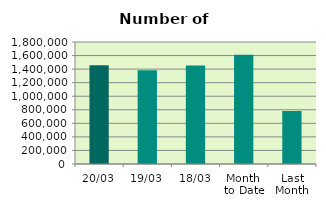
| Category | Series 0 |
|---|---|
| 20/03 | 1456998 |
| 19/03 | 1382338 |
| 18/03 | 1452778 |
| Month 
to Date | 1613573.867 |
| Last
Month | 783511.9 |